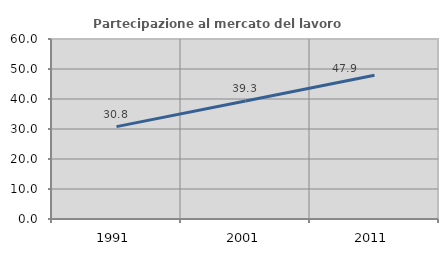
| Category | Partecipazione al mercato del lavoro  femminile |
|---|---|
| 1991.0 | 30.792 |
| 2001.0 | 39.323 |
| 2011.0 | 47.941 |